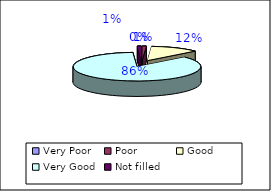
| Category | Overall how would you rate the service |
|---|---|
| Very Poor | 0 |
| Poor | 1 |
| Good | 12 |
| Very Good | 83 |
| Not filled  | 1 |